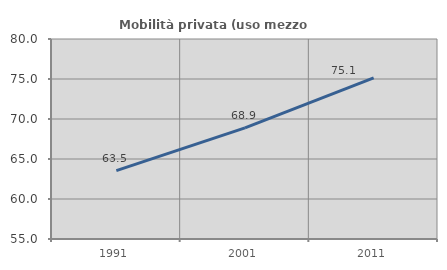
| Category | Mobilità privata (uso mezzo privato) |
|---|---|
| 1991.0 | 63.55 |
| 2001.0 | 68.892 |
| 2011.0 | 75.132 |